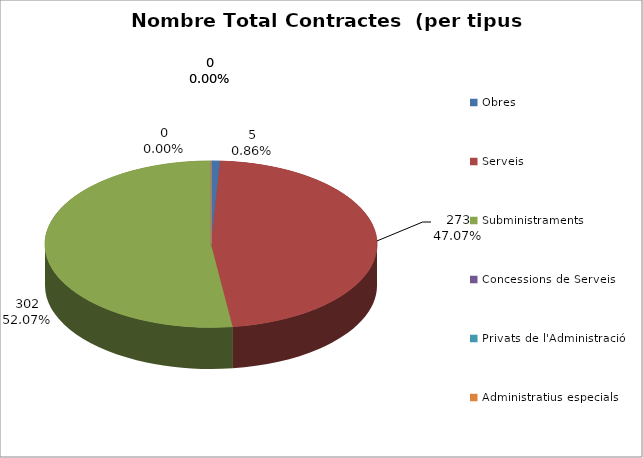
| Category | Nombre Total Contractes |
|---|---|
| Obres | 5 |
| Serveis | 273 |
| Subministraments | 302 |
| Concessions de Serveis | 0 |
| Privats de l'Administració | 0 |
| Administratius especials | 0 |